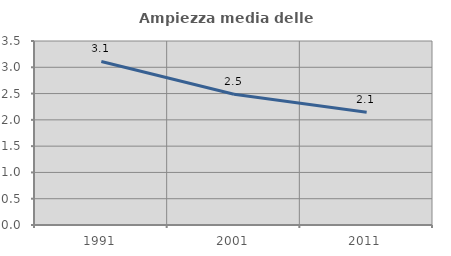
| Category | Ampiezza media delle famiglie |
|---|---|
| 1991.0 | 3.11 |
| 2001.0 | 2.487 |
| 2011.0 | 2.145 |